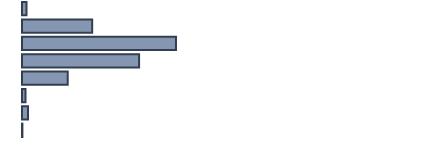
| Category | Series 0 |
|---|---|
| 0 | 1.1 |
| 1 | 17.5 |
| 2 | 38.4 |
| 3 | 29.2 |
| 4 | 11.4 |
| 5 | 0.9 |
| 6 | 1.5 |
| 7 | 0.1 |